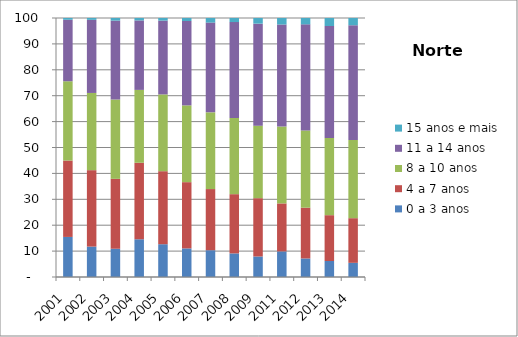
| Category | 0 a 3 anos | 4 a 7 anos | 8 a 10 anos | 11 a 14 anos | 15 anos e mais |
|---|---|---|---|---|---|
| 2001.0 | 15.47 | 29.5 | 30.61 | 23.74 | 0.68 |
| 2002.0 | 11.74 | 29.51 | 29.81 | 28.23 | 0.72 |
| 2003.0 | 10.91 | 26.99 | 30.63 | 30.46 | 1.01 |
| 2004.0 | 14.57 | 29.54 | 28.13 | 26.82 | 0.95 |
| 2005.0 | 12.66 | 28.19 | 29.65 | 28.49 | 1.02 |
| 2006.0 | 11.04 | 25.58 | 29.64 | 32.58 | 1.16 |
| 2007.0 | 10.34 | 23.61 | 29.63 | 34.65 | 1.76 |
| 2008.0 | 9.11 | 22.87 | 29.43 | 37.02 | 1.56 |
| 2009.0 | 7.92 | 22.51 | 28 | 39.38 | 2.19 |
| 2011.0 | 9.88 | 18.53 | 29.69 | 39.38 | 2.52 |
| 2012.0 | 7.16 | 19.6 | 29.83 | 40.95 | 2.45 |
| 2013.0 | 6.18 | 17.69 | 29.8 | 43.23 | 3.11 |
| 2014.0 | 5.47 | 17.24 | 30.18 | 44.31 | 2.81 |